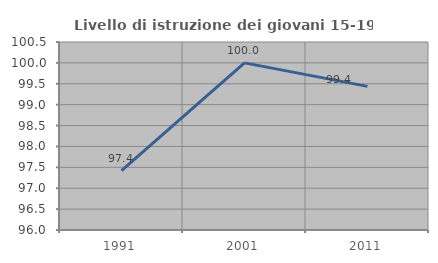
| Category | Livello di istruzione dei giovani 15-19 anni |
|---|---|
| 1991.0 | 97.42 |
| 2001.0 | 100 |
| 2011.0 | 99.438 |